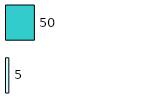
| Category | Series 0 | Series 1 |
|---|---|---|
| 0 | 5 | 50 |